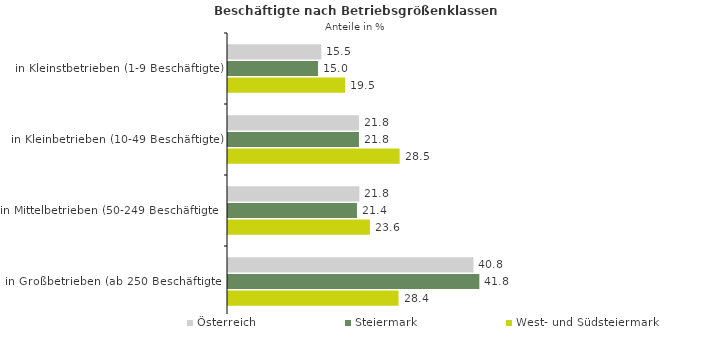
| Category | Österreich | Steiermark | West- und Südsteiermark |
|---|---|---|---|
| in Kleinstbetrieben (1-9 Beschäftigte) | 15.526 | 14.966 | 19.489 |
| in Kleinbetrieben (10-49 Beschäftigte) | 21.796 | 21.781 | 28.545 |
| in Mittelbetrieben (50-249 Beschäftigte) | 21.849 | 21.447 | 23.605 |
| in Großbetrieben (ab 250 Beschäftigte) | 40.829 | 41.806 | 28.362 |